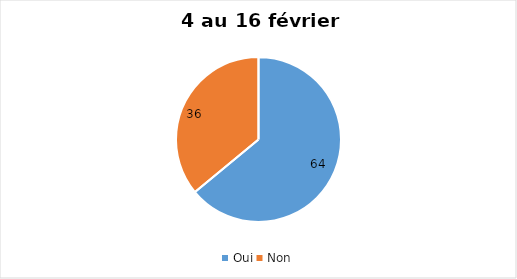
| Category | 4 au 16 février 2022 |
|---|---|
| Oui | 64 |
| Non | 36 |